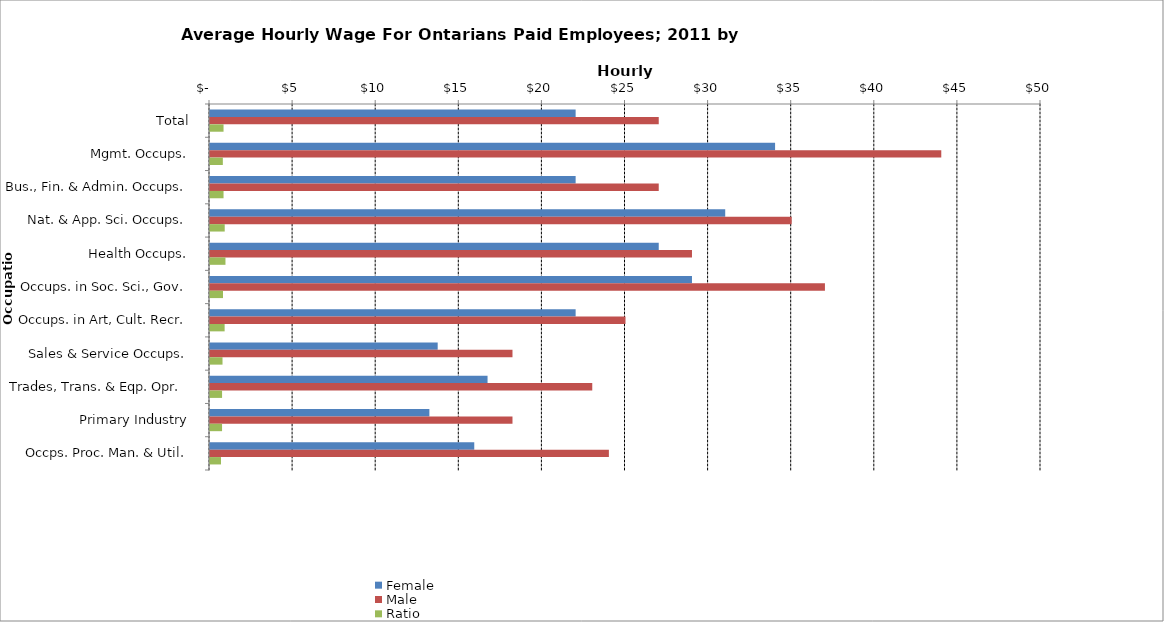
| Category | Female | Male | Ratio |
|---|---|---|---|
| Total | 22 | 27 | 0.815 |
|  Mgmt. Occups.  | 34 | 44 | 0.773 |
|  Bus., Fin. & Admin. Occups.  | 22 | 27 | 0.815 |
|  Nat. & App. Sci. Occups.  | 31 | 35 | 0.886 |
|  Health Occups.  | 27 | 29 | 0.931 |
|  Occups. in Soc. Sci., Gov.  | 29 | 37 | 0.784 |
|  Occups. in Art, Cult. Recr.  | 22 | 25 | 0.88 |
|  Sales & Service Occups.  | 13.7 | 18.2 | 0.753 |
|  Trades, Trans. & Eqp. Opr.   | 16.7 | 23 | 0.726 |
|  Primary Industry  | 13.2 | 18.2 | 0.725 |
|  Occps. Proc. Man. & Util.  | 15.9 | 24 | 0.662 |